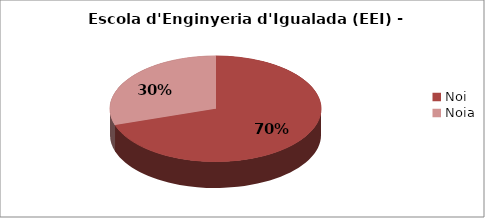
| Category | Escola d'Enginyeria d'Igualada (EEI) - Gènere |
|---|---|
| Noi | 0.7 |
| Noia | 0.3 |